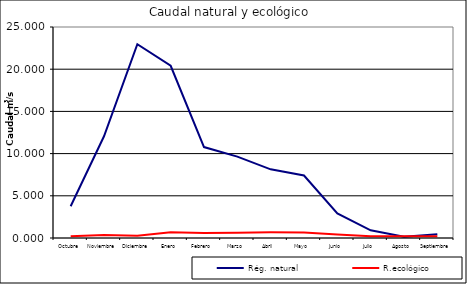
| Category | Rég. natural | R.ecológico |
|---|---|---|
| Octubre | 3.763 | 0.22 |
| Noviembre | 12.052 | 0.343 |
| Diciembre | 22.961 | 0.272 |
| Enero | 20.405 | 0.679 |
| Febrero | 10.776 | 0.599 |
| Marzo | 9.642 | 0.628 |
| Abril | 8.137 | 0.676 |
| Mayo | 7.409 | 0.638 |
| Junio | 2.909 | 0.42 |
| Julio | 0.916 | 0.206 |
| Agosto | 0.151 | 0.201 |
| Septiembre | 0.455 | 0.206 |